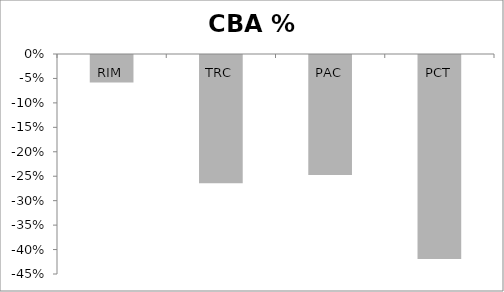
| Category | % Difference |
|---|---|
| RIM | -0.058 |
| TRC | -0.264 |
| PAC | -0.248 |
| PCT | -0.419 |